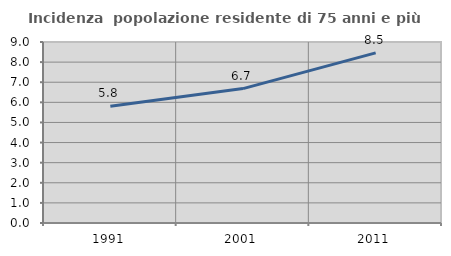
| Category | Incidenza  popolazione residente di 75 anni e più |
|---|---|
| 1991.0 | 5.803 |
| 2001.0 | 6.684 |
| 2011.0 | 8.46 |